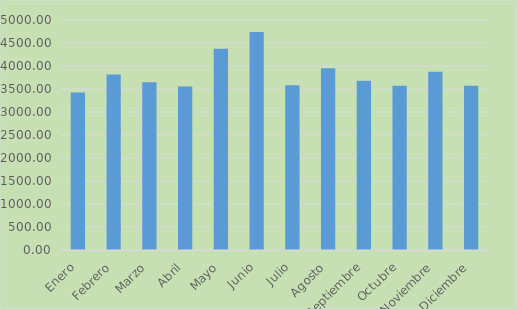
| Category | Residuos ordinarios dispuestos en relleno sanitario 
Periodo 2022 |
|---|---|
| Enero | 3425.51 |
| Febrero | 3812.84 |
| Marzo | 3644.18 |
| Abril | 3556.64 |
| Mayo | 4373.46 |
| Junio | 4739.31 |
| Julio | 3579.17 |
| Agosto | 3951.1 |
| Septiembre | 3678.6 |
| Octubre | 3569.15 |
| Noviembre | 3876.34 |
| Diciembre | 3568 |